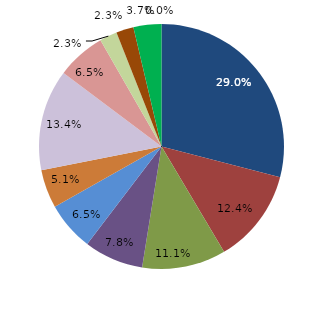
| Category | Series 0 |
|---|---|
| قبل الدخول | 29.032 |
| -1 | 12.442 |
| 1 | 11.06 |
| 2 | 7.834 |
| 3 | 6.452 |
| 4 | 5.069 |
|  5 - 9 | 13.364 |
|  10 - 14 | 6.452 |
|  15 - 19 | 2.304 |
|  20 - 24 | 2.304 |
| 25 + | 3.687 |
| غير مبين | 0 |